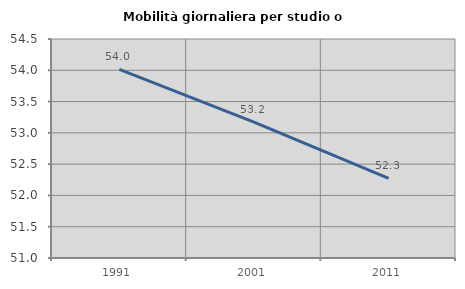
| Category | Mobilità giornaliera per studio o lavoro |
|---|---|
| 1991.0 | 54.014 |
| 2001.0 | 53.173 |
| 2011.0 | 52.273 |